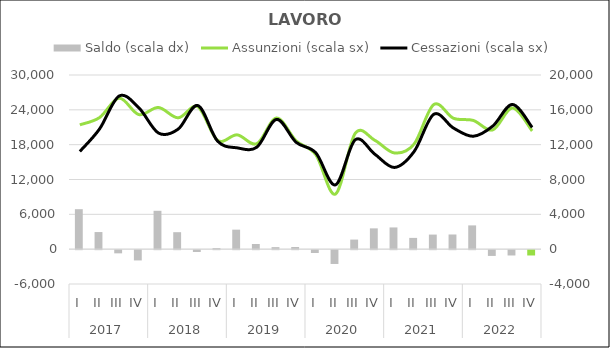
| Category | Saldo (scala dx) |
|---|---|
| 0 | 4590 |
| 1 | 1965 |
| 2 | -365 |
| 3 | -1180 |
| 4 | 4405 |
| 5 | 1950 |
| 6 | -210 |
| 7 | 125 |
| 8 | 2240 |
| 9 | 595 |
| 10 | 235 |
| 11 | 250 |
| 12 | -325 |
| 13 | -1585 |
| 14 | 1100 |
| 15 | 2390 |
| 16 | 2495 |
| 17 | 1295 |
| 18 | 1675 |
| 19 | 1685 |
| 20 | 2730 |
| 21 | -660 |
| 22 | -610 |
| 23 | -610 |